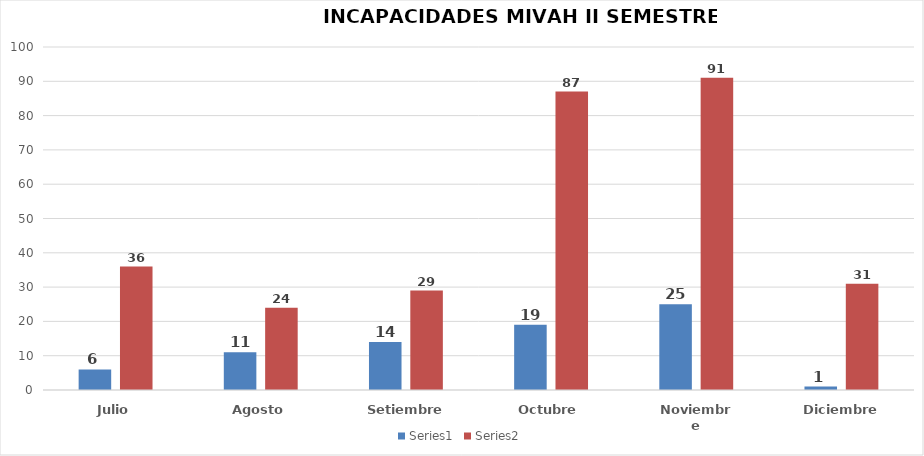
| Category | Series 0 | Series 1 |
|---|---|---|
| Julio | 6 | 36 |
| Agosto | 11 | 24 |
| Setiembre | 14 | 29 |
| Octubre | 19 | 87 |
| Noviembre | 25 | 91 |
| Diciembre | 1 | 31 |